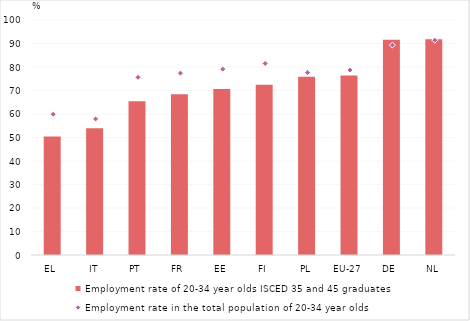
| Category | Employment rate of 20-34 year olds ISCED 35 and 45 graduates |
|---|---|
| EL | 50.4 |
| IT | 53.9 |
| PT | 65.4 |
| FR | 68.4 |
| EE | 70.6 |
| FI | 72.4 |
| PL | 75.8 |
| EU-27 | 76.4 |
| DE | 91.6 |
| NL | 91.8 |